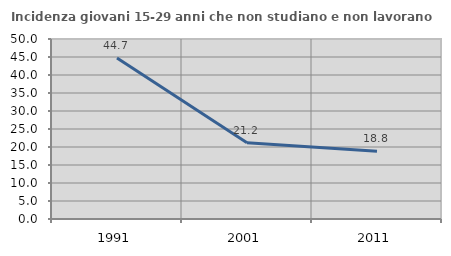
| Category | Incidenza giovani 15-29 anni che non studiano e non lavorano  |
|---|---|
| 1991.0 | 44.721 |
| 2001.0 | 21.192 |
| 2011.0 | 18.831 |